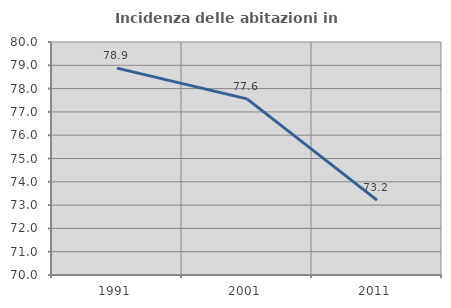
| Category | Incidenza delle abitazioni in proprietà  |
|---|---|
| 1991.0 | 78.879 |
| 2001.0 | 77.56 |
| 2011.0 | 73.211 |